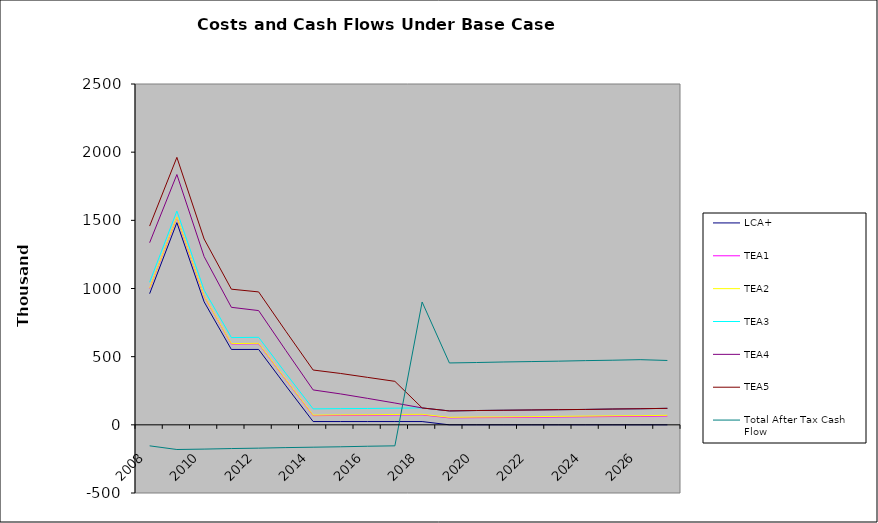
| Category | LCA+ | TEA1 | TEA2 | TEA3 | TEA4 | TEA5 | Total After Tax Cash Flow |
|---|---|---|---|---|---|---|---|
| 2008.0 | 962 | 998.892 | 1002 | 1046 | 1336 | 1458 | -154 |
| 2009.0 | 1483 | 1520.814 | 1524 | 1568 | 1836 | 1962 | -181 |
| 2010.0 | 902 | 940.737 | 944 | 988 | 1234 | 1363 | -178 |
| 2011.0 | 553 | 592.659 | 596 | 640 | 862 | 995 | -174 |
| 2012.0 | 553 | 594.504 | 598 | 642 | 838 | 975 | -171 |
| 2013.0 | 286 | 328.426 | 332 | 377 | 545 | 686 | -167 |
| 2014.0 | 24 | 67.348 | 71 | 117 | 256 | 402 | -164 |
| 2015.0 | 24 | 69.193 | 73 | 119 | 227 | 377 | -161 |
| 2016.0 | 24 | 70.115 | 74 | 120 | 194 | 348 | -157 |
| 2017.0 | 24 | 71.96 | 76 | 122 | 160 | 319 | -154 |
| 2018.0 | 24 | 72.882 | 77 | 124 | 124 | 124 | 901 |
| 2019.0 | 0 | 50.727 | 55 | 102 | 102 | 102 | 454 |
| 2020.0 | 0 | 52.571 | 57 | 105 | 105 | 105 | 457 |
| 2021.0 | 0 | 53.493 | 58 | 107 | 107 | 107 | 461 |
| 2022.0 | 0 | 55.338 | 60 | 109 | 109 | 109 | 464 |
| 2023.0 | 0 | 57.183 | 62 | 111 | 111 | 111 | 467 |
| 2024.0 | 0 | 59.027 | 64 | 113 | 113 | 113 | 471 |
| 2025.0 | 0 | 60.872 | 66 | 116 | 116 | 116 | 474 |
| 2026.0 | 0 | 61.794 | 67 | 118 | 118 | 118 | 478 |
| 2027.0 | 0 | 64.561 | 70 | 121 | 121 | 121 | 472 |